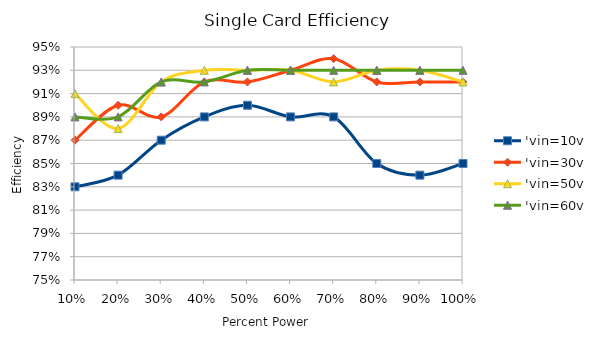
| Category | 'vin=10v | 'vin=30v | 'vin=50v | 'vin=60v |
|---|---|---|---|---|
| 0 | 0.83 | 0.87 | 0.91 | 0.89 |
| 1 | 0.84 | 0.9 | 0.88 | 0.89 |
| 2 | 0.87 | 0.89 | 0.92 | 0.92 |
| 3 | 0.89 | 0.92 | 0.93 | 0.92 |
| 4 | 0.9 | 0.92 | 0.93 | 0.93 |
| 5 | 0.89 | 0.93 | 0.93 | 0.93 |
| 6 | 0.89 | 0.94 | 0.92 | 0.93 |
| 7 | 0.85 | 0.92 | 0.93 | 0.93 |
| 8 | 0.84 | 0.92 | 0.93 | 0.93 |
| 9 | 0.85 | 0.92 | 0.92 | 0.93 |